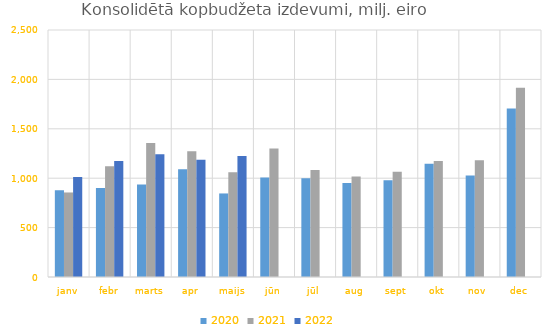
| Category | 2020 | 2021 | 2022 |
|---|---|---|---|
| janv | 878360.095 | 855571.821 | 1011780.956 |
| febr | 900276.14 | 1120070.85 | 1174583.857 |
| marts | 935266.915 | 1355758.12 | 1242068.533 |
| apr | 1090965.926 | 1273663.147 | 1187341.457 |
| maijs | 845625.072 | 1060453.286 | 1224137.323 |
| jūn | 1007637.852 | 1299852.065 | 0 |
| jūl | 999723.1 | 1081981.296 | 0 |
| aug | 951921.221 | 1017502.093 | 0 |
| sept | 978775.82 | 1064391.019 | 0 |
| okt | 1146014.897 | 1173896.626 | 0 |
| nov | 1028398.84 | 1182055.554 | 0 |
| dec | 1706433.895 | 1915376.849 | 0 |